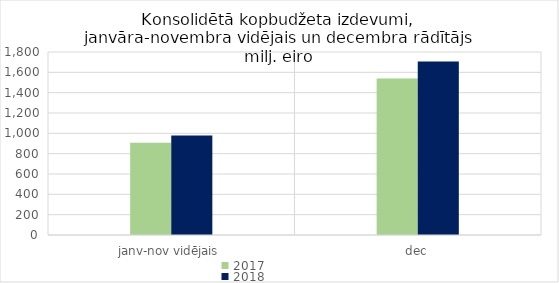
| Category | 2017 | 2018 |
|---|---|---|
| janv-nov vidējais | 908498.038 | 978451.443 |
| dec | 1538492.902 | 1706433.895 |